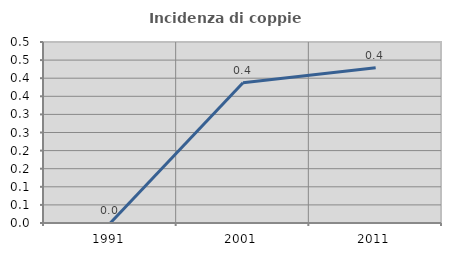
| Category | Incidenza di coppie miste |
|---|---|
| 1991.0 | 0 |
| 2001.0 | 0.388 |
| 2011.0 | 0.429 |